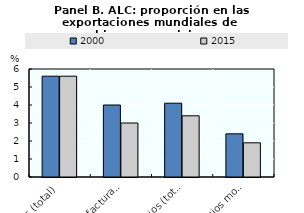
| Category | 2000 | 2015 |
|---|---|---|
| Bienes (total) | 5.6 | 5.6 |
| Manufacturas de alta tecnología | 4 | 3 |
| Servicios (total) | 4.1 | 3.4 |
| Servicios modernos | 2.4 | 1.9 |